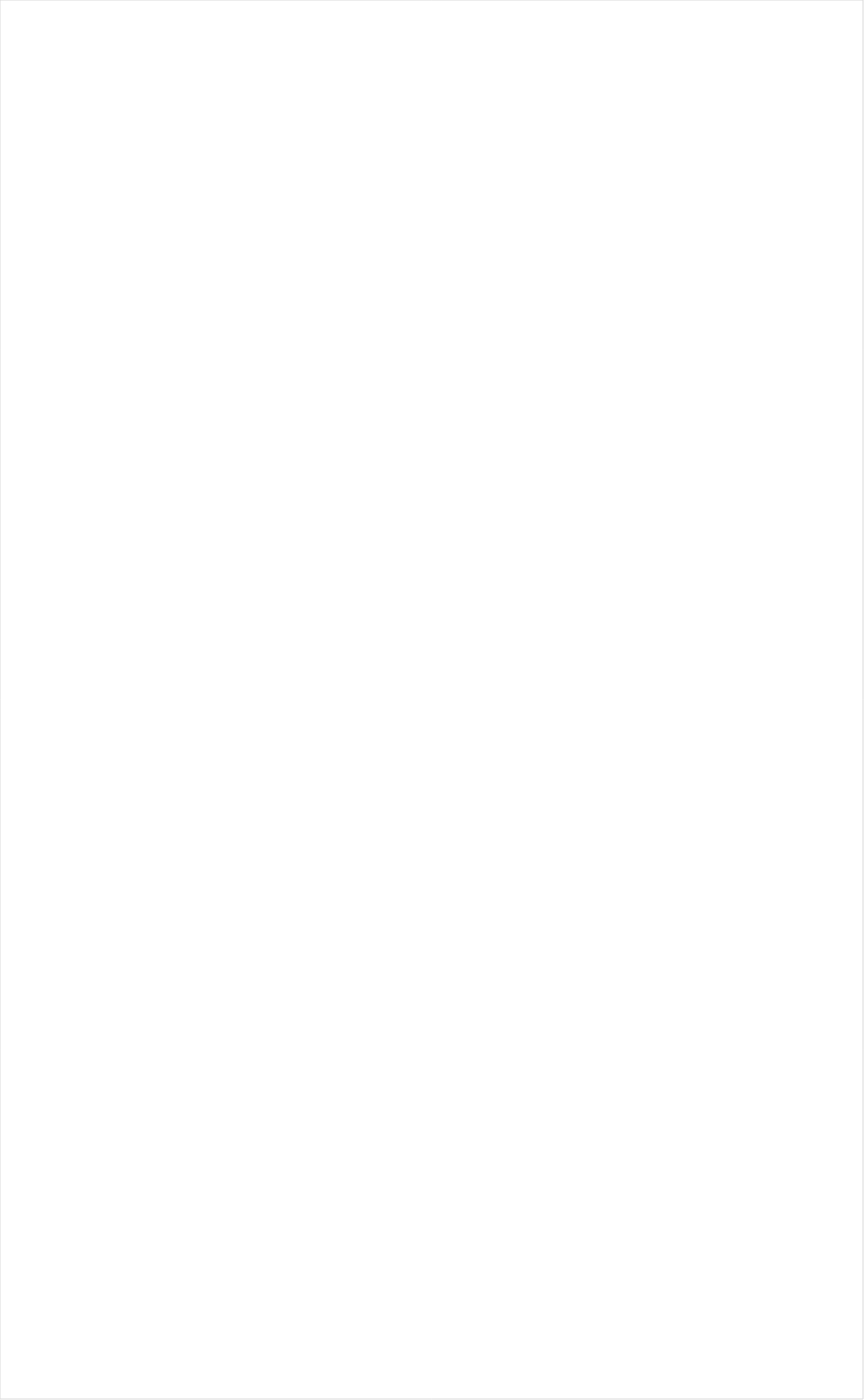
| Category | Total |
|---|---|
| PAC-12 Network | -0.233 |
| RFD TV | -0.218 |
| Hallmark Movies & Mysteries | -0.206 |
| PBS | -0.19 |
| INSP | -0.184 |
| Tennis Channel | -0.184 |
| CBS Sports | -0.175 |
| Olympic Channel | -0.175 |
| Smithsonian | -0.165 |
| MSNBC | -0.157 |
| Fox Business | -0.145 |
| Fox News | -0.136 |
| Hallmark | -0.133 |
| Science Channel | -0.133 |
| National Geographic Wild | -0.123 |
| Ovation | -0.122 |
| CBS | -0.117 |
| American Heroes Channel | -0.107 |
| FYI | -0.098 |
| DIY | -0.096 |
| History Channel | -0.095 |
| MLB Network | -0.091 |
| Logo | -0.089 |
| CNN | -0.083 |
| Weather Channel | -0.083 |
| Outdoor Channel | -0.082 |
| Golf | -0.079 |
| Headline News | -0.077 |
| NBC | -0.073 |
| Cooking Channel | -0.072 |
| UP TV | -0.069 |
| Game Show | -0.068 |
| CW | -0.068 |
| Reelz Channel | -0.068 |
| WGN America | -0.067 |
| HGTV | -0.066 |
| Motor Trend Network | -0.063 |
| Destination America | -0.063 |
| SundanceTV | -0.058 |
| ABC | -0.057 |
| ION | -0.056 |
| TV LAND | -0.054 |
| The Sportsman Channel | -0.052 |
| Discovery Family Channel | -0.052 |
| BBC America | -0.052 |
| Great American Country | -0.051 |
| National Geographic | -0.05 |
| Investigation Discovery | -0.049 |
| ESPNU | -0.047 |
| ESPNEWS | -0.047 |
| Animal Planet | -0.044 |
| Oprah Winfrey Network | -0.044 |
| Big Ten Network | -0.041 |
| POP | -0.041 |
| Travel | -0.039 |
| Discovery Channel | -0.033 |
| FOX | -0.029 |
| Fox Sports 1 | -0.018 |
| Independent Film (IFC) | -0.018 |
| Food Network | -0.017 |
| Bloomberg HD | -0.017 |
| CMTV | -0.014 |
| OXYGEN | -0.012 |
| AMC | -0.004 |
| TLC | -0.003 |
| NFL Network | -0.002 |
| TNT | -0.001 |
| Discovery Life Channel | 0.004 |
| WE TV | 0.004 |
| NHL | 0.01 |
| SYFY | 0.011 |
| A&E | 0.011 |
| FX Movie Channel | 0.018 |
| NBC Sports | 0.021 |
| USA Network | 0.024 |
| MyNetworkTV | 0.027 |
| TV ONE | 0.027 |
| Lifetime | 0.029 |
| Paramount Network | 0.03 |
| BRAVO | 0.032 |
| TBS | 0.033 |
| BET Her | 0.037 |
| CNBC | 0.043 |
| ESPN2 | 0.056 |
| Freeform | 0.06 |
| Lifetime Movies | 0.061 |
| FXDEP | 0.062 |
| NBA TV | 0.062 |
| Viceland | 0.066 |
| Disney XD | 0.067 |
| FX | 0.072 |
| ESPN | 0.082 |
| E! | 0.095 |
| Disney Channel | 0.1 |
| BET | 0.102 |
| FXX | 0.104 |
| Comedy Central | 0.116 |
| truTV | 0.12 |
| Nick@Nite | 0.147 |
| Teen Nick | 0.155 |
| Nick Toons | 0.16 |
| MTV2 | 0.161 |
| Nick | 0.162 |
| NBC Universo | 0.181 |
| MTV | 0.186 |
| Telemundo | 0.203 |
| ESPN Deportes | 0.206 |
| Universal Kids | 0.206 |
| Adult Swim | 0.209 |
| VH1 | 0.214 |
| Cartoon Network | 0.215 |
| Univision | 0.221 |
| UniMas | 0.229 |
| Galavision | 0.251 |
| Nick Jr. | 0.31 |
| Disney Junior US | 0.328 |
| TUDN | 0.354 |